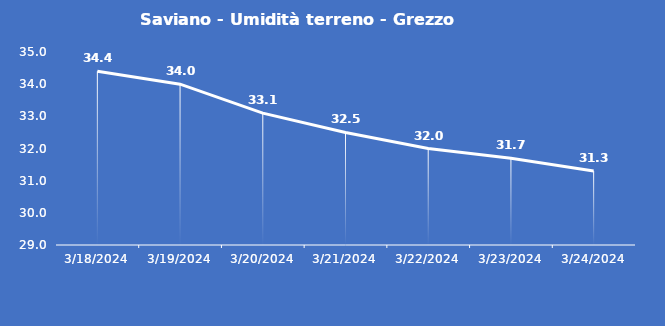
| Category | Saviano - Umidità terreno - Grezzo (%VWC) |
|---|---|
| 3/18/24 | 34.4 |
| 3/19/24 | 34 |
| 3/20/24 | 33.1 |
| 3/21/24 | 32.5 |
| 3/22/24 | 32 |
| 3/23/24 | 31.7 |
| 3/24/24 | 31.3 |